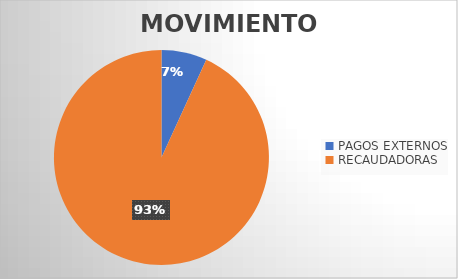
| Category | MOVIMIENTOS |
|---|---|
| PAGOS EXTERNOS | 1083 |
| RECAUDADORAS | 14752 |